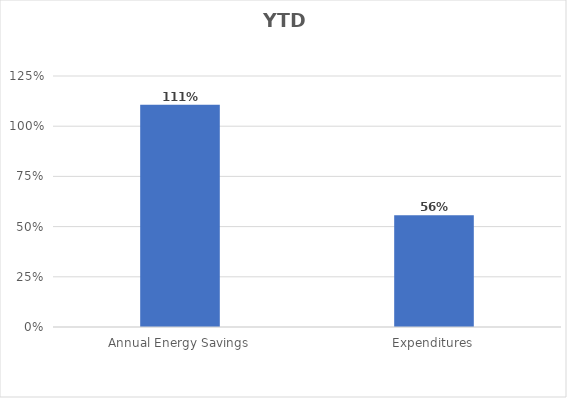
| Category | Series 0 |
|---|---|
| Annual Energy Savings | 1.107 |
| Expenditures | 0.557 |